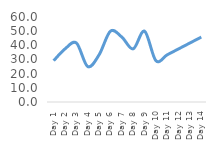
| Category | Throughput |
|---|---|
| Day 1 | 29.167 |
| Day 2 | 37.5 |
| Day 3 | 41.667 |
| Day 4 | 25 |
| Day 5 | 33.333 |
| Day 6 | 50 |
| Day 7 | 45.833 |
| Day 8 | 37.5 |
| Day 9 | 50 |
| Day 10 | 29.167 |
| Day 11 | 33.333 |
| Day 12 | 37.5 |
| Day 13 | 41.667 |
| Day 14 | 45.833 |